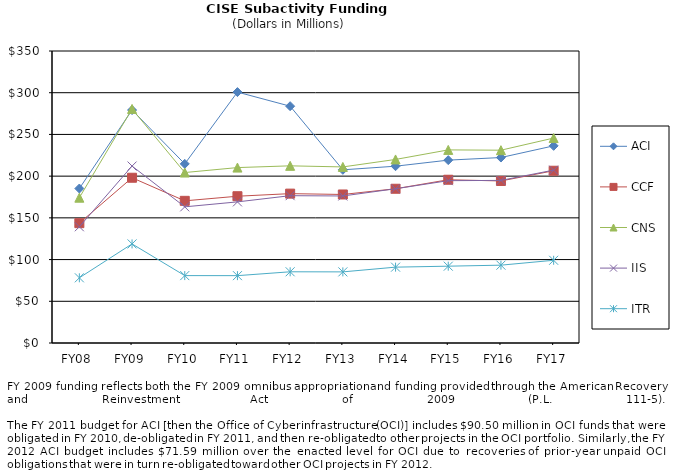
| Category | ACI | CCF | CNS | IIS | ITR |
|---|---|---|---|---|---|
| FY08 | 185.15 | 143.63 | 174.16 | 139.33 | 78.14 |
| FY09 | 279.23 | 198.09 | 280.55 | 212.1 | 118.76 |
| FY10 | 214.72 | 170.398 | 204.325 | 163.213 | 80.78 |
| FY11 | 300.75 | 175.932 | 210.258 | 169.143 | 80.73 |
| FY12 | 283.84 | 179.03 | 212.36 | 176.58 | 85.35 |
| FY13 | 207.587 | 178.021 | 211.034 | 176.231 | 85.252 |
| FY14 | 211.93 | 184.88 | 220.02 | 184.87 | 90.91 |
| FY15 | 219.19 | 195.69 | 231.45 | 194.58 | 92.07 |
| FY16 | 222.3 | 194.23 | 231.1 | 194.9 | 93.29 |
| FY17 | 236.31 | 206.47 | 245.66 | 207.2 | 99.16 |